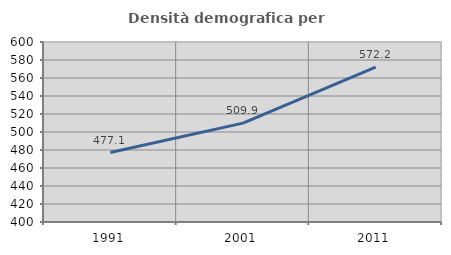
| Category | Densità demografica |
|---|---|
| 1991.0 | 477.134 |
| 2001.0 | 509.857 |
| 2011.0 | 572.172 |